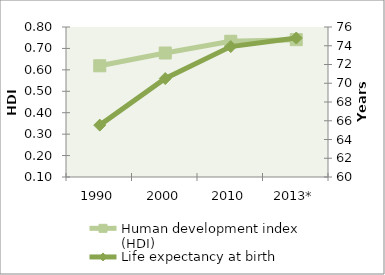
| Category | Human development index (HDI) |
|---|---|
| 1990 | 0.619 |
| 2000 | 0.679 |
| 2010 | 0.733 |
| 2013* | 0.741 |